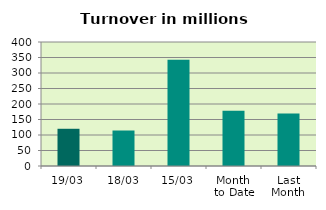
| Category | Series 0 |
|---|---|
| 19/03 | 120.063 |
| 18/03 | 114.492 |
| 15/03 | 342.561 |
| Month 
to Date | 178.079 |
| Last
Month | 168.971 |